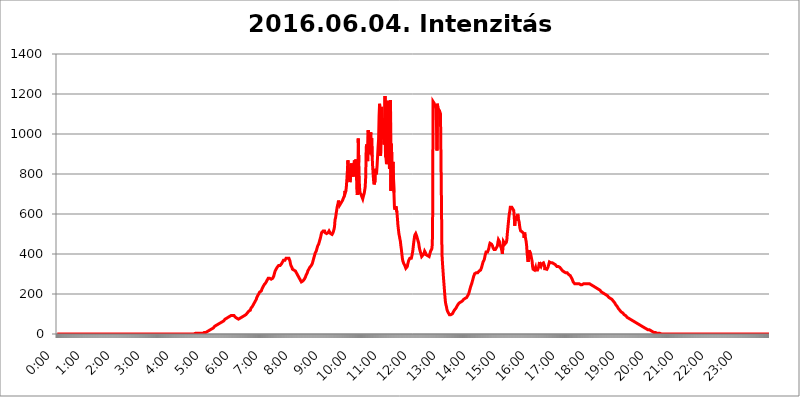
| Category | 2016.06.04. Intenzitás [W/m^2] |
|---|---|
| 0.0 | 0 |
| 0.0006944444444444445 | 0 |
| 0.001388888888888889 | 0 |
| 0.0020833333333333333 | 0 |
| 0.002777777777777778 | 0 |
| 0.003472222222222222 | 0 |
| 0.004166666666666667 | 0 |
| 0.004861111111111111 | 0 |
| 0.005555555555555556 | 0 |
| 0.0062499999999999995 | 0 |
| 0.006944444444444444 | 0 |
| 0.007638888888888889 | 0 |
| 0.008333333333333333 | 0 |
| 0.009027777777777779 | 0 |
| 0.009722222222222222 | 0 |
| 0.010416666666666666 | 0 |
| 0.011111111111111112 | 0 |
| 0.011805555555555555 | 0 |
| 0.012499999999999999 | 0 |
| 0.013194444444444444 | 0 |
| 0.013888888888888888 | 0 |
| 0.014583333333333332 | 0 |
| 0.015277777777777777 | 0 |
| 0.015972222222222224 | 0 |
| 0.016666666666666666 | 0 |
| 0.017361111111111112 | 0 |
| 0.018055555555555557 | 0 |
| 0.01875 | 0 |
| 0.019444444444444445 | 0 |
| 0.02013888888888889 | 0 |
| 0.020833333333333332 | 0 |
| 0.02152777777777778 | 0 |
| 0.022222222222222223 | 0 |
| 0.02291666666666667 | 0 |
| 0.02361111111111111 | 0 |
| 0.024305555555555556 | 0 |
| 0.024999999999999998 | 0 |
| 0.025694444444444447 | 0 |
| 0.02638888888888889 | 0 |
| 0.027083333333333334 | 0 |
| 0.027777777777777776 | 0 |
| 0.02847222222222222 | 0 |
| 0.029166666666666664 | 0 |
| 0.029861111111111113 | 0 |
| 0.030555555555555555 | 0 |
| 0.03125 | 0 |
| 0.03194444444444445 | 0 |
| 0.03263888888888889 | 0 |
| 0.03333333333333333 | 0 |
| 0.034027777777777775 | 0 |
| 0.034722222222222224 | 0 |
| 0.035416666666666666 | 0 |
| 0.036111111111111115 | 0 |
| 0.03680555555555556 | 0 |
| 0.0375 | 0 |
| 0.03819444444444444 | 0 |
| 0.03888888888888889 | 0 |
| 0.03958333333333333 | 0 |
| 0.04027777777777778 | 0 |
| 0.04097222222222222 | 0 |
| 0.041666666666666664 | 0 |
| 0.042361111111111106 | 0 |
| 0.04305555555555556 | 0 |
| 0.043750000000000004 | 0 |
| 0.044444444444444446 | 0 |
| 0.04513888888888889 | 0 |
| 0.04583333333333334 | 0 |
| 0.04652777777777778 | 0 |
| 0.04722222222222222 | 0 |
| 0.04791666666666666 | 0 |
| 0.04861111111111111 | 0 |
| 0.049305555555555554 | 0 |
| 0.049999999999999996 | 0 |
| 0.05069444444444445 | 0 |
| 0.051388888888888894 | 0 |
| 0.052083333333333336 | 0 |
| 0.05277777777777778 | 0 |
| 0.05347222222222222 | 0 |
| 0.05416666666666667 | 0 |
| 0.05486111111111111 | 0 |
| 0.05555555555555555 | 0 |
| 0.05625 | 0 |
| 0.05694444444444444 | 0 |
| 0.057638888888888885 | 0 |
| 0.05833333333333333 | 0 |
| 0.05902777777777778 | 0 |
| 0.059722222222222225 | 0 |
| 0.06041666666666667 | 0 |
| 0.061111111111111116 | 0 |
| 0.06180555555555556 | 0 |
| 0.0625 | 0 |
| 0.06319444444444444 | 0 |
| 0.06388888888888888 | 0 |
| 0.06458333333333334 | 0 |
| 0.06527777777777778 | 0 |
| 0.06597222222222222 | 0 |
| 0.06666666666666667 | 0 |
| 0.06736111111111111 | 0 |
| 0.06805555555555555 | 0 |
| 0.06874999999999999 | 0 |
| 0.06944444444444443 | 0 |
| 0.07013888888888889 | 0 |
| 0.07083333333333333 | 0 |
| 0.07152777777777779 | 0 |
| 0.07222222222222223 | 0 |
| 0.07291666666666667 | 0 |
| 0.07361111111111111 | 0 |
| 0.07430555555555556 | 0 |
| 0.075 | 0 |
| 0.07569444444444444 | 0 |
| 0.0763888888888889 | 0 |
| 0.07708333333333334 | 0 |
| 0.07777777777777778 | 0 |
| 0.07847222222222222 | 0 |
| 0.07916666666666666 | 0 |
| 0.0798611111111111 | 0 |
| 0.08055555555555556 | 0 |
| 0.08125 | 0 |
| 0.08194444444444444 | 0 |
| 0.08263888888888889 | 0 |
| 0.08333333333333333 | 0 |
| 0.08402777777777777 | 0 |
| 0.08472222222222221 | 0 |
| 0.08541666666666665 | 0 |
| 0.08611111111111112 | 0 |
| 0.08680555555555557 | 0 |
| 0.08750000000000001 | 0 |
| 0.08819444444444445 | 0 |
| 0.08888888888888889 | 0 |
| 0.08958333333333333 | 0 |
| 0.09027777777777778 | 0 |
| 0.09097222222222222 | 0 |
| 0.09166666666666667 | 0 |
| 0.09236111111111112 | 0 |
| 0.09305555555555556 | 0 |
| 0.09375 | 0 |
| 0.09444444444444444 | 0 |
| 0.09513888888888888 | 0 |
| 0.09583333333333333 | 0 |
| 0.09652777777777777 | 0 |
| 0.09722222222222222 | 0 |
| 0.09791666666666667 | 0 |
| 0.09861111111111111 | 0 |
| 0.09930555555555555 | 0 |
| 0.09999999999999999 | 0 |
| 0.10069444444444443 | 0 |
| 0.1013888888888889 | 0 |
| 0.10208333333333335 | 0 |
| 0.10277777777777779 | 0 |
| 0.10347222222222223 | 0 |
| 0.10416666666666667 | 0 |
| 0.10486111111111111 | 0 |
| 0.10555555555555556 | 0 |
| 0.10625 | 0 |
| 0.10694444444444444 | 0 |
| 0.1076388888888889 | 0 |
| 0.10833333333333334 | 0 |
| 0.10902777777777778 | 0 |
| 0.10972222222222222 | 0 |
| 0.1111111111111111 | 0 |
| 0.11180555555555556 | 0 |
| 0.11180555555555556 | 0 |
| 0.1125 | 0 |
| 0.11319444444444444 | 0 |
| 0.11388888888888889 | 0 |
| 0.11458333333333333 | 0 |
| 0.11527777777777777 | 0 |
| 0.11597222222222221 | 0 |
| 0.11666666666666665 | 0 |
| 0.1173611111111111 | 0 |
| 0.11805555555555557 | 0 |
| 0.11944444444444445 | 0 |
| 0.12013888888888889 | 0 |
| 0.12083333333333333 | 0 |
| 0.12152777777777778 | 0 |
| 0.12222222222222223 | 0 |
| 0.12291666666666667 | 0 |
| 0.12291666666666667 | 0 |
| 0.12361111111111112 | 0 |
| 0.12430555555555556 | 0 |
| 0.125 | 0 |
| 0.12569444444444444 | 0 |
| 0.12638888888888888 | 0 |
| 0.12708333333333333 | 0 |
| 0.16875 | 0 |
| 0.12847222222222224 | 0 |
| 0.12916666666666668 | 0 |
| 0.12986111111111112 | 0 |
| 0.13055555555555556 | 0 |
| 0.13125 | 0 |
| 0.13194444444444445 | 0 |
| 0.1326388888888889 | 0 |
| 0.13333333333333333 | 0 |
| 0.13402777777777777 | 0 |
| 0.13402777777777777 | 0 |
| 0.13472222222222222 | 0 |
| 0.13541666666666666 | 0 |
| 0.1361111111111111 | 0 |
| 0.13749999999999998 | 0 |
| 0.13819444444444443 | 0 |
| 0.1388888888888889 | 0 |
| 0.13958333333333334 | 0 |
| 0.14027777777777778 | 0 |
| 0.14097222222222222 | 0 |
| 0.14166666666666666 | 0 |
| 0.1423611111111111 | 0 |
| 0.14305555555555557 | 0 |
| 0.14375000000000002 | 0 |
| 0.14444444444444446 | 0 |
| 0.1451388888888889 | 0 |
| 0.1451388888888889 | 0 |
| 0.14652777777777778 | 0 |
| 0.14722222222222223 | 0 |
| 0.14791666666666667 | 0 |
| 0.1486111111111111 | 0 |
| 0.14930555555555555 | 0 |
| 0.15 | 0 |
| 0.15069444444444444 | 0 |
| 0.15138888888888888 | 0 |
| 0.15208333333333332 | 0 |
| 0.15277777777777776 | 0 |
| 0.15347222222222223 | 0 |
| 0.15416666666666667 | 0 |
| 0.15486111111111112 | 0 |
| 0.15555555555555556 | 0 |
| 0.15625 | 0 |
| 0.15694444444444444 | 0 |
| 0.15763888888888888 | 0 |
| 0.15833333333333333 | 0 |
| 0.15902777777777777 | 0 |
| 0.15972222222222224 | 0 |
| 0.16041666666666668 | 0 |
| 0.16111111111111112 | 0 |
| 0.16180555555555556 | 0 |
| 0.1625 | 0 |
| 0.16319444444444445 | 0 |
| 0.1638888888888889 | 0 |
| 0.16458333333333333 | 0 |
| 0.16527777777777777 | 0 |
| 0.16597222222222222 | 0 |
| 0.16666666666666666 | 0 |
| 0.1673611111111111 | 0 |
| 0.16805555555555554 | 0 |
| 0.16874999999999998 | 0 |
| 0.16944444444444443 | 0 |
| 0.17013888888888887 | 0 |
| 0.1708333333333333 | 0 |
| 0.17152777777777775 | 0 |
| 0.17222222222222225 | 0 |
| 0.1729166666666667 | 0 |
| 0.17361111111111113 | 0 |
| 0.17430555555555557 | 0 |
| 0.17500000000000002 | 0 |
| 0.17569444444444446 | 0 |
| 0.1763888888888889 | 0 |
| 0.17708333333333334 | 0 |
| 0.17777777777777778 | 0 |
| 0.17847222222222223 | 0 |
| 0.17916666666666667 | 0 |
| 0.1798611111111111 | 0 |
| 0.18055555555555555 | 0 |
| 0.18125 | 0 |
| 0.18194444444444444 | 0 |
| 0.1826388888888889 | 0 |
| 0.18333333333333335 | 0 |
| 0.1840277777777778 | 0 |
| 0.18472222222222223 | 0 |
| 0.18541666666666667 | 0 |
| 0.18611111111111112 | 0 |
| 0.18680555555555556 | 0 |
| 0.1875 | 0 |
| 0.18819444444444444 | 0 |
| 0.18888888888888888 | 0 |
| 0.18958333333333333 | 0 |
| 0.19027777777777777 | 0 |
| 0.1909722222222222 | 0 |
| 0.19166666666666665 | 0 |
| 0.19236111111111112 | 0 |
| 0.19305555555555554 | 0 |
| 0.19375 | 3.525 |
| 0.19444444444444445 | 3.525 |
| 0.1951388888888889 | 3.525 |
| 0.19583333333333333 | 3.525 |
| 0.19652777777777777 | 3.525 |
| 0.19722222222222222 | 3.525 |
| 0.19791666666666666 | 3.525 |
| 0.1986111111111111 | 3.525 |
| 0.19930555555555554 | 3.525 |
| 0.19999999999999998 | 3.525 |
| 0.20069444444444443 | 3.525 |
| 0.20138888888888887 | 3.525 |
| 0.2020833333333333 | 3.525 |
| 0.2027777777777778 | 3.525 |
| 0.2034722222222222 | 3.525 |
| 0.2041666666666667 | 3.525 |
| 0.20486111111111113 | 3.525 |
| 0.20555555555555557 | 7.887 |
| 0.20625000000000002 | 7.887 |
| 0.20694444444444446 | 7.887 |
| 0.2076388888888889 | 7.887 |
| 0.20833333333333334 | 7.887 |
| 0.20902777777777778 | 12.257 |
| 0.20972222222222223 | 12.257 |
| 0.21041666666666667 | 12.257 |
| 0.2111111111111111 | 16.636 |
| 0.21180555555555555 | 16.636 |
| 0.2125 | 16.636 |
| 0.21319444444444444 | 21.024 |
| 0.2138888888888889 | 21.024 |
| 0.21458333333333335 | 21.024 |
| 0.2152777777777778 | 25.419 |
| 0.21597222222222223 | 25.419 |
| 0.21666666666666667 | 25.419 |
| 0.21736111111111112 | 29.823 |
| 0.21805555555555556 | 29.823 |
| 0.21875 | 29.823 |
| 0.21944444444444444 | 34.234 |
| 0.22013888888888888 | 34.234 |
| 0.22083333333333333 | 38.653 |
| 0.22152777777777777 | 38.653 |
| 0.2222222222222222 | 38.653 |
| 0.22291666666666665 | 43.079 |
| 0.2236111111111111 | 43.079 |
| 0.22430555555555556 | 47.511 |
| 0.225 | 47.511 |
| 0.22569444444444445 | 47.511 |
| 0.2263888888888889 | 47.511 |
| 0.22708333333333333 | 51.951 |
| 0.22777777777777777 | 51.951 |
| 0.22847222222222222 | 56.398 |
| 0.22916666666666666 | 56.398 |
| 0.2298611111111111 | 56.398 |
| 0.23055555555555554 | 56.398 |
| 0.23124999999999998 | 60.85 |
| 0.23194444444444443 | 60.85 |
| 0.23263888888888887 | 60.85 |
| 0.2333333333333333 | 65.31 |
| 0.2340277777777778 | 69.775 |
| 0.2347222222222222 | 69.775 |
| 0.2354166666666667 | 74.246 |
| 0.23611111111111113 | 74.246 |
| 0.23680555555555557 | 78.722 |
| 0.23750000000000002 | 78.722 |
| 0.23819444444444446 | 83.205 |
| 0.2388888888888889 | 83.205 |
| 0.23958333333333334 | 83.205 |
| 0.24027777777777778 | 83.205 |
| 0.24097222222222223 | 87.692 |
| 0.24166666666666667 | 87.692 |
| 0.2423611111111111 | 92.184 |
| 0.24305555555555555 | 92.184 |
| 0.24375 | 92.184 |
| 0.24444444444444446 | 92.184 |
| 0.24513888888888888 | 92.184 |
| 0.24583333333333335 | 92.184 |
| 0.2465277777777778 | 92.184 |
| 0.24722222222222223 | 92.184 |
| 0.24791666666666667 | 92.184 |
| 0.24861111111111112 | 92.184 |
| 0.24930555555555556 | 87.692 |
| 0.25 | 83.205 |
| 0.25069444444444444 | 83.205 |
| 0.2513888888888889 | 78.722 |
| 0.2520833333333333 | 78.722 |
| 0.25277777777777777 | 74.246 |
| 0.2534722222222222 | 74.246 |
| 0.25416666666666665 | 74.246 |
| 0.2548611111111111 | 78.722 |
| 0.2555555555555556 | 78.722 |
| 0.25625000000000003 | 78.722 |
| 0.2569444444444445 | 78.722 |
| 0.2576388888888889 | 83.205 |
| 0.25833333333333336 | 83.205 |
| 0.2590277777777778 | 87.692 |
| 0.25972222222222224 | 87.692 |
| 0.2604166666666667 | 87.692 |
| 0.2611111111111111 | 92.184 |
| 0.26180555555555557 | 92.184 |
| 0.2625 | 92.184 |
| 0.26319444444444445 | 96.682 |
| 0.2638888888888889 | 96.682 |
| 0.26458333333333334 | 96.682 |
| 0.2652777777777778 | 101.184 |
| 0.2659722222222222 | 101.184 |
| 0.26666666666666666 | 105.69 |
| 0.2673611111111111 | 105.69 |
| 0.26805555555555555 | 110.201 |
| 0.26875 | 114.716 |
| 0.26944444444444443 | 114.716 |
| 0.2701388888888889 | 119.235 |
| 0.2708333333333333 | 119.235 |
| 0.27152777777777776 | 128.284 |
| 0.2722222222222222 | 128.284 |
| 0.27291666666666664 | 132.814 |
| 0.2736111111111111 | 137.347 |
| 0.2743055555555555 | 141.884 |
| 0.27499999999999997 | 146.423 |
| 0.27569444444444446 | 150.964 |
| 0.27638888888888885 | 155.509 |
| 0.27708333333333335 | 160.056 |
| 0.2777777777777778 | 164.605 |
| 0.27847222222222223 | 169.156 |
| 0.2791666666666667 | 173.709 |
| 0.2798611111111111 | 182.82 |
| 0.28055555555555556 | 187.378 |
| 0.28125 | 191.937 |
| 0.28194444444444444 | 196.497 |
| 0.2826388888888889 | 201.058 |
| 0.2833333333333333 | 205.62 |
| 0.28402777777777777 | 210.182 |
| 0.2847222222222222 | 210.182 |
| 0.28541666666666665 | 214.746 |
| 0.28611111111111115 | 214.746 |
| 0.28680555555555554 | 219.309 |
| 0.28750000000000003 | 228.436 |
| 0.2881944444444445 | 233 |
| 0.2888888888888889 | 237.564 |
| 0.28958333333333336 | 242.127 |
| 0.2902777777777778 | 246.689 |
| 0.29097222222222224 | 251.251 |
| 0.2916666666666667 | 251.251 |
| 0.2923611111111111 | 255.813 |
| 0.29305555555555557 | 260.373 |
| 0.29375 | 264.932 |
| 0.29444444444444445 | 264.932 |
| 0.2951388888888889 | 269.49 |
| 0.29583333333333334 | 278.603 |
| 0.2965277777777778 | 278.603 |
| 0.2972222222222222 | 283.156 |
| 0.29791666666666666 | 278.603 |
| 0.2986111111111111 | 278.603 |
| 0.29930555555555555 | 274.047 |
| 0.3 | 274.047 |
| 0.30069444444444443 | 274.047 |
| 0.3013888888888889 | 274.047 |
| 0.3020833333333333 | 278.603 |
| 0.30277777777777776 | 283.156 |
| 0.3034722222222222 | 287.709 |
| 0.30416666666666664 | 296.808 |
| 0.3048611111111111 | 305.898 |
| 0.3055555555555555 | 314.98 |
| 0.30624999999999997 | 319.517 |
| 0.3069444444444444 | 324.052 |
| 0.3076388888888889 | 328.584 |
| 0.30833333333333335 | 333.113 |
| 0.3090277777777778 | 333.113 |
| 0.30972222222222223 | 333.113 |
| 0.3104166666666667 | 342.162 |
| 0.3111111111111111 | 342.162 |
| 0.31180555555555556 | 342.162 |
| 0.3125 | 342.162 |
| 0.31319444444444444 | 342.162 |
| 0.3138888888888889 | 342.162 |
| 0.3145833333333333 | 351.198 |
| 0.31527777777777777 | 355.712 |
| 0.3159722222222222 | 360.221 |
| 0.31666666666666665 | 364.728 |
| 0.31736111111111115 | 369.23 |
| 0.31805555555555554 | 369.23 |
| 0.31875000000000003 | 369.23 |
| 0.3194444444444445 | 369.23 |
| 0.3201388888888889 | 373.729 |
| 0.32083333333333336 | 378.224 |
| 0.3215277777777778 | 378.224 |
| 0.32222222222222224 | 378.224 |
| 0.3229166666666667 | 378.224 |
| 0.3236111111111111 | 382.715 |
| 0.32430555555555557 | 382.715 |
| 0.325 | 378.224 |
| 0.32569444444444445 | 373.729 |
| 0.3263888888888889 | 364.728 |
| 0.32708333333333334 | 351.198 |
| 0.3277777777777778 | 342.162 |
| 0.3284722222222222 | 337.639 |
| 0.32916666666666666 | 333.113 |
| 0.3298611111111111 | 324.052 |
| 0.33055555555555555 | 319.517 |
| 0.33125 | 319.517 |
| 0.33194444444444443 | 319.517 |
| 0.3326388888888889 | 319.517 |
| 0.3333333333333333 | 319.517 |
| 0.3340277777777778 | 314.98 |
| 0.3347222222222222 | 310.44 |
| 0.3354166666666667 | 305.898 |
| 0.3361111111111111 | 301.354 |
| 0.3368055555555556 | 296.808 |
| 0.33749999999999997 | 296.808 |
| 0.33819444444444446 | 287.709 |
| 0.33888888888888885 | 283.156 |
| 0.33958333333333335 | 278.603 |
| 0.34027777777777773 | 274.047 |
| 0.34097222222222223 | 269.49 |
| 0.3416666666666666 | 264.932 |
| 0.3423611111111111 | 260.373 |
| 0.3430555555555555 | 260.373 |
| 0.34375 | 264.932 |
| 0.3444444444444445 | 264.932 |
| 0.3451388888888889 | 269.49 |
| 0.3458333333333334 | 269.49 |
| 0.34652777777777777 | 274.047 |
| 0.34722222222222227 | 278.603 |
| 0.34791666666666665 | 283.156 |
| 0.34861111111111115 | 287.709 |
| 0.34930555555555554 | 296.808 |
| 0.35000000000000003 | 301.354 |
| 0.3506944444444444 | 305.898 |
| 0.3513888888888889 | 314.98 |
| 0.3520833333333333 | 319.517 |
| 0.3527777777777778 | 324.052 |
| 0.3534722222222222 | 328.584 |
| 0.3541666666666667 | 333.113 |
| 0.3548611111111111 | 337.639 |
| 0.35555555555555557 | 337.639 |
| 0.35625 | 342.162 |
| 0.35694444444444445 | 346.682 |
| 0.3576388888888889 | 351.198 |
| 0.35833333333333334 | 360.221 |
| 0.3590277777777778 | 369.23 |
| 0.3597222222222222 | 378.224 |
| 0.36041666666666666 | 387.202 |
| 0.3611111111111111 | 396.164 |
| 0.36180555555555555 | 405.108 |
| 0.3625 | 409.574 |
| 0.36319444444444443 | 414.035 |
| 0.3638888888888889 | 422.943 |
| 0.3645833333333333 | 431.833 |
| 0.3652777777777778 | 440.702 |
| 0.3659722222222222 | 445.129 |
| 0.3666666666666667 | 449.551 |
| 0.3673611111111111 | 458.38 |
| 0.3680555555555556 | 467.187 |
| 0.36874999999999997 | 475.972 |
| 0.36944444444444446 | 484.735 |
| 0.37013888888888885 | 497.836 |
| 0.37083333333333335 | 506.542 |
| 0.37152777777777773 | 510.885 |
| 0.37222222222222223 | 510.885 |
| 0.3729166666666666 | 515.223 |
| 0.3736111111111111 | 510.885 |
| 0.3743055555555555 | 510.885 |
| 0.375 | 515.223 |
| 0.3756944444444445 | 506.542 |
| 0.3763888888888889 | 506.542 |
| 0.3770833333333334 | 502.192 |
| 0.37777777777777777 | 502.192 |
| 0.37847222222222227 | 502.192 |
| 0.37916666666666665 | 506.542 |
| 0.37986111111111115 | 506.542 |
| 0.38055555555555554 | 510.885 |
| 0.38125000000000003 | 515.223 |
| 0.3819444444444444 | 515.223 |
| 0.3826388888888889 | 510.885 |
| 0.3833333333333333 | 502.192 |
| 0.3840277777777778 | 497.836 |
| 0.3847222222222222 | 497.836 |
| 0.3854166666666667 | 497.836 |
| 0.3861111111111111 | 497.836 |
| 0.38680555555555557 | 506.542 |
| 0.3875 | 510.885 |
| 0.38819444444444445 | 523.88 |
| 0.3888888888888889 | 536.82 |
| 0.38958333333333334 | 571.049 |
| 0.3902777777777778 | 579.542 |
| 0.3909722222222222 | 596.45 |
| 0.39166666666666666 | 613.252 |
| 0.3923611111111111 | 629.948 |
| 0.39305555555555555 | 642.4 |
| 0.39375 | 650.667 |
| 0.39444444444444443 | 667.123 |
| 0.3951388888888889 | 650.667 |
| 0.3958333333333333 | 642.4 |
| 0.3965277777777778 | 646.537 |
| 0.3972222222222222 | 650.667 |
| 0.3979166666666667 | 654.791 |
| 0.3986111111111111 | 658.909 |
| 0.3993055555555556 | 663.019 |
| 0.39999999999999997 | 667.123 |
| 0.40069444444444446 | 671.22 |
| 0.40138888888888885 | 679.395 |
| 0.40208333333333335 | 683.473 |
| 0.40277777777777773 | 691.608 |
| 0.40347222222222223 | 715.858 |
| 0.4041666666666666 | 707.8 |
| 0.4048611111111111 | 715.858 |
| 0.4055555555555555 | 739.877 |
| 0.40625 | 775.492 |
| 0.4069444444444445 | 814.519 |
| 0.4076388888888889 | 868.305 |
| 0.4083333333333334 | 829.981 |
| 0.40902777777777777 | 787.258 |
| 0.40972222222222227 | 775.492 |
| 0.41041666666666665 | 759.723 |
| 0.41111111111111115 | 767.62 |
| 0.41180555555555554 | 802.868 |
| 0.41250000000000003 | 853.029 |
| 0.4131944444444444 | 818.392 |
| 0.4138888888888889 | 798.974 |
| 0.4145833333333333 | 818.392 |
| 0.4152777777777778 | 787.258 |
| 0.4159722222222222 | 841.526 |
| 0.4166666666666667 | 868.305 |
| 0.4173611111111111 | 868.305 |
| 0.41805555555555557 | 853.029 |
| 0.41875 | 872.114 |
| 0.41944444444444445 | 841.526 |
| 0.4201388888888889 | 727.896 |
| 0.42083333333333334 | 695.666 |
| 0.4215277777777778 | 719.877 |
| 0.4222222222222222 | 977.508 |
| 0.42291666666666666 | 856.855 |
| 0.4236111111111111 | 759.723 |
| 0.42430555555555555 | 715.858 |
| 0.425 | 703.762 |
| 0.42569444444444443 | 699.717 |
| 0.4263888888888889 | 695.666 |
| 0.4270833333333333 | 687.544 |
| 0.4277777777777778 | 683.473 |
| 0.4284722222222222 | 675.311 |
| 0.4291666666666667 | 675.311 |
| 0.4298611111111111 | 695.666 |
| 0.4305555555555556 | 703.762 |
| 0.43124999999999997 | 707.8 |
| 0.43194444444444446 | 735.89 |
| 0.43263888888888885 | 787.258 |
| 0.43333333333333335 | 932.576 |
| 0.43402777777777773 | 947.58 |
| 0.43472222222222223 | 891.099 |
| 0.4354166666666666 | 864.493 |
| 0.4361111111111111 | 1018.587 |
| 0.4368055555555555 | 999.916 |
| 0.4375 | 966.295 |
| 0.4381944444444445 | 943.832 |
| 0.4388888888888889 | 898.668 |
| 0.4395833333333334 | 1007.383 |
| 0.44027777777777777 | 943.832 |
| 0.44097222222222227 | 977.508 |
| 0.44166666666666665 | 887.309 |
| 0.44236111111111115 | 837.682 |
| 0.44305555555555554 | 798.974 |
| 0.44375000000000003 | 763.674 |
| 0.4444444444444444 | 747.834 |
| 0.4451388888888889 | 751.803 |
| 0.4458333333333333 | 767.62 |
| 0.4465277777777778 | 826.123 |
| 0.4472222222222222 | 798.974 |
| 0.4479166666666667 | 806.757 |
| 0.4486111111111111 | 841.526 |
| 0.44930555555555557 | 837.682 |
| 0.45 | 936.33 |
| 0.45069444444444445 | 973.772 |
| 0.4513888888888889 | 1089.873 |
| 0.45208333333333334 | 1150.946 |
| 0.4527777777777778 | 1097.437 |
| 0.4534722222222222 | 891.099 |
| 0.45416666666666666 | 996.182 |
| 0.4548611111111111 | 1135.543 |
| 0.45555555555555555 | 973.772 |
| 0.45625 | 977.508 |
| 0.45694444444444443 | 1078.555 |
| 0.4576388888888889 | 1029.798 |
| 0.4583333333333333 | 947.58 |
| 0.4590277777777778 | 1048.508 |
| 0.4597222222222222 | 1189.969 |
| 0.4604166666666667 | 887.309 |
| 0.4611111111111111 | 879.719 |
| 0.4618055555555556 | 849.199 |
| 0.46249999999999997 | 898.668 |
| 0.46319444444444446 | 1166.46 |
| 0.46388888888888885 | 1007.383 |
| 0.46458333333333335 | 898.668 |
| 0.46527777777777773 | 984.98 |
| 0.46597222222222223 | 826.123 |
| 0.4666666666666666 | 845.365 |
| 0.4673611111111111 | 1170.358 |
| 0.4680555555555555 | 715.858 |
| 0.46875 | 951.327 |
| 0.4694444444444445 | 826.123 |
| 0.4701388888888889 | 814.519 |
| 0.4708333333333334 | 860.676 |
| 0.47152777777777777 | 864.493 |
| 0.47222222222222227 | 707.8 |
| 0.47291666666666665 | 634.105 |
| 0.47361111111111115 | 621.613 |
| 0.47430555555555554 | 617.436 |
| 0.47500000000000003 | 638.256 |
| 0.4756944444444444 | 634.105 |
| 0.4763888888888889 | 609.062 |
| 0.4770833333333333 | 579.542 |
| 0.4777777777777778 | 545.416 |
| 0.4784722222222222 | 523.88 |
| 0.4791666666666667 | 502.192 |
| 0.4798611111111111 | 489.108 |
| 0.48055555555555557 | 475.972 |
| 0.48125 | 462.786 |
| 0.48194444444444445 | 440.702 |
| 0.4826388888888889 | 422.943 |
| 0.48333333333333334 | 400.638 |
| 0.4840277777777778 | 378.224 |
| 0.4847222222222222 | 364.728 |
| 0.48541666666666666 | 360.221 |
| 0.4861111111111111 | 351.198 |
| 0.48680555555555555 | 346.682 |
| 0.4875 | 342.162 |
| 0.48819444444444443 | 337.639 |
| 0.4888888888888889 | 328.584 |
| 0.4895833333333333 | 324.052 |
| 0.4902777777777778 | 328.584 |
| 0.4909722222222222 | 337.639 |
| 0.4916666666666667 | 351.198 |
| 0.4923611111111111 | 360.221 |
| 0.4930555555555556 | 369.23 |
| 0.49374999999999997 | 373.729 |
| 0.49444444444444446 | 378.224 |
| 0.49513888888888885 | 378.224 |
| 0.49583333333333335 | 378.224 |
| 0.49652777777777773 | 378.224 |
| 0.49722222222222223 | 387.202 |
| 0.4979166666666666 | 400.638 |
| 0.4986111111111111 | 414.035 |
| 0.4993055555555555 | 436.27 |
| 0.5 | 458.38 |
| 0.5006944444444444 | 475.972 |
| 0.5013888888888889 | 493.475 |
| 0.5020833333333333 | 497.836 |
| 0.5027777777777778 | 502.192 |
| 0.5034722222222222 | 497.836 |
| 0.5041666666666667 | 489.108 |
| 0.5048611111111111 | 480.356 |
| 0.5055555555555555 | 471.582 |
| 0.50625 | 462.786 |
| 0.5069444444444444 | 453.968 |
| 0.5076388888888889 | 436.27 |
| 0.5083333333333333 | 422.943 |
| 0.5090277777777777 | 414.035 |
| 0.5097222222222222 | 405.108 |
| 0.5104166666666666 | 396.164 |
| 0.5111111111111112 | 387.202 |
| 0.5118055555555555 | 387.202 |
| 0.5125000000000001 | 391.685 |
| 0.5131944444444444 | 396.164 |
| 0.513888888888889 | 396.164 |
| 0.5145833333333333 | 405.108 |
| 0.5152777777777778 | 414.035 |
| 0.5159722222222222 | 409.574 |
| 0.5166666666666667 | 405.108 |
| 0.517361111111111 | 396.164 |
| 0.5180555555555556 | 391.685 |
| 0.5187499999999999 | 391.685 |
| 0.5194444444444445 | 391.685 |
| 0.5201388888888888 | 387.202 |
| 0.5208333333333334 | 387.202 |
| 0.5215277777777778 | 387.202 |
| 0.5222222222222223 | 396.164 |
| 0.5229166666666667 | 405.108 |
| 0.5236111111111111 | 414.035 |
| 0.5243055555555556 | 418.492 |
| 0.525 | 422.943 |
| 0.5256944444444445 | 431.833 |
| 0.5263888888888889 | 497.836 |
| 0.5270833333333333 | 1162.571 |
| 0.5277777777777778 | 1162.571 |
| 0.5284722222222222 | 1154.814 |
| 0.5291666666666667 | 1147.086 |
| 0.5298611111111111 | 1147.086 |
| 0.5305555555555556 | 1139.384 |
| 0.53125 | 1147.086 |
| 0.5319444444444444 | 1037.277 |
| 0.5326388888888889 | 917.534 |
| 0.5333333333333333 | 1150.946 |
| 0.5340277777777778 | 1108.816 |
| 0.5347222222222222 | 1124.056 |
| 0.5354166666666667 | 1120.238 |
| 0.5361111111111111 | 1116.426 |
| 0.5368055555555555 | 1116.426 |
| 0.5375 | 1101.226 |
| 0.5381944444444444 | 1101.226 |
| 0.5388888888888889 | 650.667 |
| 0.5395833333333333 | 400.638 |
| 0.5402777777777777 | 355.712 |
| 0.5409722222222222 | 319.517 |
| 0.5416666666666666 | 283.156 |
| 0.5423611111111112 | 251.251 |
| 0.5430555555555555 | 219.309 |
| 0.5437500000000001 | 187.378 |
| 0.5444444444444444 | 160.056 |
| 0.545138888888889 | 146.423 |
| 0.5458333333333333 | 137.347 |
| 0.5465277777777778 | 123.758 |
| 0.5472222222222222 | 114.716 |
| 0.5479166666666667 | 110.201 |
| 0.548611111111111 | 105.69 |
| 0.5493055555555556 | 101.184 |
| 0.5499999999999999 | 96.682 |
| 0.5506944444444445 | 92.184 |
| 0.5513888888888888 | 96.682 |
| 0.5520833333333334 | 96.682 |
| 0.5527777777777778 | 96.682 |
| 0.5534722222222223 | 101.184 |
| 0.5541666666666667 | 101.184 |
| 0.5548611111111111 | 105.69 |
| 0.5555555555555556 | 110.201 |
| 0.55625 | 114.716 |
| 0.5569444444444445 | 119.235 |
| 0.5576388888888889 | 119.235 |
| 0.5583333333333333 | 123.758 |
| 0.5590277777777778 | 128.284 |
| 0.5597222222222222 | 132.814 |
| 0.5604166666666667 | 137.347 |
| 0.5611111111111111 | 141.884 |
| 0.5618055555555556 | 146.423 |
| 0.5625 | 146.423 |
| 0.5631944444444444 | 150.964 |
| 0.5638888888888889 | 155.509 |
| 0.5645833333333333 | 155.509 |
| 0.5652777777777778 | 160.056 |
| 0.5659722222222222 | 160.056 |
| 0.5666666666666667 | 164.605 |
| 0.5673611111111111 | 164.605 |
| 0.5680555555555555 | 164.605 |
| 0.56875 | 169.156 |
| 0.5694444444444444 | 169.156 |
| 0.5701388888888889 | 173.709 |
| 0.5708333333333333 | 173.709 |
| 0.5715277777777777 | 173.709 |
| 0.5722222222222222 | 178.264 |
| 0.5729166666666666 | 178.264 |
| 0.5736111111111112 | 182.82 |
| 0.5743055555555555 | 182.82 |
| 0.5750000000000001 | 182.82 |
| 0.5756944444444444 | 191.937 |
| 0.576388888888889 | 196.497 |
| 0.5770833333333333 | 201.058 |
| 0.5777777777777778 | 210.182 |
| 0.5784722222222222 | 219.309 |
| 0.5791666666666667 | 228.436 |
| 0.579861111111111 | 237.564 |
| 0.5805555555555556 | 242.127 |
| 0.5812499999999999 | 251.251 |
| 0.5819444444444445 | 260.373 |
| 0.5826388888888888 | 269.49 |
| 0.5833333333333334 | 278.603 |
| 0.5840277777777778 | 287.709 |
| 0.5847222222222223 | 292.259 |
| 0.5854166666666667 | 301.354 |
| 0.5861111111111111 | 305.898 |
| 0.5868055555555556 | 305.898 |
| 0.5875 | 305.898 |
| 0.5881944444444445 | 301.354 |
| 0.5888888888888889 | 305.898 |
| 0.5895833333333333 | 305.898 |
| 0.5902777777777778 | 310.44 |
| 0.5909722222222222 | 310.44 |
| 0.5916666666666667 | 314.98 |
| 0.5923611111111111 | 314.98 |
| 0.5930555555555556 | 314.98 |
| 0.59375 | 319.517 |
| 0.5944444444444444 | 324.052 |
| 0.5951388888888889 | 333.113 |
| 0.5958333333333333 | 342.162 |
| 0.5965277777777778 | 351.198 |
| 0.5972222222222222 | 360.221 |
| 0.5979166666666667 | 364.728 |
| 0.5986111111111111 | 369.23 |
| 0.5993055555555555 | 378.224 |
| 0.6 | 391.685 |
| 0.6006944444444444 | 400.638 |
| 0.6013888888888889 | 409.574 |
| 0.6020833333333333 | 414.035 |
| 0.6027777777777777 | 409.574 |
| 0.6034722222222222 | 409.574 |
| 0.6041666666666666 | 414.035 |
| 0.6048611111111112 | 422.943 |
| 0.6055555555555555 | 431.833 |
| 0.6062500000000001 | 445.129 |
| 0.6069444444444444 | 453.968 |
| 0.607638888888889 | 458.38 |
| 0.6083333333333333 | 458.38 |
| 0.6090277777777778 | 449.551 |
| 0.6097222222222222 | 445.129 |
| 0.6104166666666667 | 440.702 |
| 0.611111111111111 | 431.833 |
| 0.6118055555555556 | 427.39 |
| 0.6124999999999999 | 422.943 |
| 0.6131944444444445 | 422.943 |
| 0.6138888888888888 | 422.943 |
| 0.6145833333333334 | 422.943 |
| 0.6152777777777778 | 422.943 |
| 0.6159722222222223 | 431.833 |
| 0.6166666666666667 | 431.833 |
| 0.6173611111111111 | 440.702 |
| 0.6180555555555556 | 458.38 |
| 0.61875 | 471.582 |
| 0.6194444444444445 | 471.582 |
| 0.6201388888888889 | 462.786 |
| 0.6208333333333333 | 449.551 |
| 0.6215277777777778 | 445.129 |
| 0.6222222222222222 | 449.551 |
| 0.6229166666666667 | 427.39 |
| 0.6236111111111111 | 431.833 |
| 0.6243055555555556 | 400.638 |
| 0.625 | 436.27 |
| 0.6256944444444444 | 462.786 |
| 0.6263888888888889 | 462.786 |
| 0.6270833333333333 | 458.38 |
| 0.6277777777777778 | 449.551 |
| 0.6284722222222222 | 449.551 |
| 0.6291666666666667 | 453.968 |
| 0.6298611111111111 | 458.38 |
| 0.6305555555555555 | 471.582 |
| 0.63125 | 502.192 |
| 0.6319444444444444 | 528.2 |
| 0.6326388888888889 | 553.986 |
| 0.6333333333333333 | 579.542 |
| 0.6340277777777777 | 600.661 |
| 0.6347222222222222 | 613.252 |
| 0.6354166666666666 | 634.105 |
| 0.6361111111111112 | 634.105 |
| 0.6368055555555555 | 634.105 |
| 0.6375000000000001 | 634.105 |
| 0.6381944444444444 | 629.948 |
| 0.638888888888889 | 625.784 |
| 0.6395833333333333 | 621.613 |
| 0.6402777777777778 | 617.436 |
| 0.6409722222222222 | 583.779 |
| 0.6416666666666667 | 541.121 |
| 0.642361111111111 | 588.009 |
| 0.6430555555555556 | 583.779 |
| 0.6437499999999999 | 583.779 |
| 0.6444444444444445 | 566.793 |
| 0.6451388888888888 | 588.009 |
| 0.6458333333333334 | 600.661 |
| 0.6465277777777778 | 579.542 |
| 0.6472222222222223 | 583.779 |
| 0.6479166666666667 | 558.261 |
| 0.6486111111111111 | 536.82 |
| 0.6493055555555556 | 523.88 |
| 0.65 | 515.223 |
| 0.6506944444444445 | 510.885 |
| 0.6513888888888889 | 510.885 |
| 0.6520833333333333 | 510.885 |
| 0.6527777777777778 | 506.542 |
| 0.6534722222222222 | 510.885 |
| 0.6541666666666667 | 502.192 |
| 0.6548611111111111 | 480.356 |
| 0.6555555555555556 | 506.542 |
| 0.65625 | 489.108 |
| 0.6569444444444444 | 475.972 |
| 0.6576388888888889 | 462.786 |
| 0.6583333333333333 | 440.702 |
| 0.6590277777777778 | 405.108 |
| 0.6597222222222222 | 378.224 |
| 0.6604166666666667 | 360.221 |
| 0.6611111111111111 | 360.221 |
| 0.6618055555555555 | 418.492 |
| 0.6625 | 422.943 |
| 0.6631944444444444 | 422.943 |
| 0.6638888888888889 | 400.638 |
| 0.6645833333333333 | 405.108 |
| 0.6652777777777777 | 396.164 |
| 0.6659722222222222 | 364.728 |
| 0.6666666666666666 | 337.639 |
| 0.6673611111111111 | 324.052 |
| 0.6680555555555556 | 319.517 |
| 0.6687500000000001 | 319.517 |
| 0.6694444444444444 | 319.517 |
| 0.6701388888888888 | 319.517 |
| 0.6708333333333334 | 333.113 |
| 0.6715277777777778 | 319.517 |
| 0.6722222222222222 | 319.517 |
| 0.6729166666666666 | 319.517 |
| 0.6736111111111112 | 319.517 |
| 0.6743055555555556 | 324.052 |
| 0.6749999999999999 | 333.113 |
| 0.6756944444444444 | 337.639 |
| 0.6763888888888889 | 360.221 |
| 0.6770833333333334 | 346.682 |
| 0.6777777777777777 | 342.162 |
| 0.6784722222222223 | 337.639 |
| 0.6791666666666667 | 342.162 |
| 0.6798611111111111 | 351.198 |
| 0.6805555555555555 | 355.712 |
| 0.68125 | 355.712 |
| 0.6819444444444445 | 355.712 |
| 0.6826388888888889 | 351.198 |
| 0.6833333333333332 | 342.162 |
| 0.6840277777777778 | 319.517 |
| 0.6847222222222222 | 328.584 |
| 0.6854166666666667 | 324.052 |
| 0.686111111111111 | 324.052 |
| 0.6868055555555556 | 324.052 |
| 0.6875 | 324.052 |
| 0.6881944444444444 | 333.113 |
| 0.688888888888889 | 333.113 |
| 0.6895833333333333 | 351.198 |
| 0.6902777777777778 | 360.221 |
| 0.6909722222222222 | 360.221 |
| 0.6916666666666668 | 360.221 |
| 0.6923611111111111 | 355.712 |
| 0.6930555555555555 | 355.712 |
| 0.69375 | 355.712 |
| 0.6944444444444445 | 355.712 |
| 0.6951388888888889 | 351.198 |
| 0.6958333333333333 | 351.198 |
| 0.6965277777777777 | 351.198 |
| 0.6972222222222223 | 351.198 |
| 0.6979166666666666 | 346.682 |
| 0.6986111111111111 | 346.682 |
| 0.6993055555555556 | 346.682 |
| 0.7000000000000001 | 342.162 |
| 0.7006944444444444 | 337.639 |
| 0.7013888888888888 | 337.639 |
| 0.7020833333333334 | 337.639 |
| 0.7027777777777778 | 337.639 |
| 0.7034722222222222 | 333.113 |
| 0.7041666666666666 | 333.113 |
| 0.7048611111111112 | 333.113 |
| 0.7055555555555556 | 328.584 |
| 0.7062499999999999 | 328.584 |
| 0.7069444444444444 | 324.052 |
| 0.7076388888888889 | 324.052 |
| 0.7083333333333334 | 319.517 |
| 0.7090277777777777 | 314.98 |
| 0.7097222222222223 | 314.98 |
| 0.7104166666666667 | 310.44 |
| 0.7111111111111111 | 310.44 |
| 0.7118055555555555 | 305.898 |
| 0.7125 | 305.898 |
| 0.7131944444444445 | 305.898 |
| 0.7138888888888889 | 305.898 |
| 0.7145833333333332 | 305.898 |
| 0.7152777777777778 | 305.898 |
| 0.7159722222222222 | 301.354 |
| 0.7166666666666667 | 301.354 |
| 0.717361111111111 | 296.808 |
| 0.7180555555555556 | 296.808 |
| 0.71875 | 292.259 |
| 0.7194444444444444 | 292.259 |
| 0.720138888888889 | 287.709 |
| 0.7208333333333333 | 283.156 |
| 0.7215277777777778 | 278.603 |
| 0.7222222222222222 | 274.047 |
| 0.7229166666666668 | 269.49 |
| 0.7236111111111111 | 260.373 |
| 0.7243055555555555 | 255.813 |
| 0.725 | 255.813 |
| 0.7256944444444445 | 251.251 |
| 0.7263888888888889 | 251.251 |
| 0.7270833333333333 | 251.251 |
| 0.7277777777777777 | 251.251 |
| 0.7284722222222223 | 251.251 |
| 0.7291666666666666 | 251.251 |
| 0.7298611111111111 | 251.251 |
| 0.7305555555555556 | 251.251 |
| 0.7312500000000001 | 251.251 |
| 0.7319444444444444 | 251.251 |
| 0.7326388888888888 | 251.251 |
| 0.7333333333333334 | 246.689 |
| 0.7340277777777778 | 246.689 |
| 0.7347222222222222 | 246.689 |
| 0.7354166666666666 | 246.689 |
| 0.7361111111111112 | 246.689 |
| 0.7368055555555556 | 246.689 |
| 0.7374999999999999 | 246.689 |
| 0.7381944444444444 | 251.251 |
| 0.7388888888888889 | 251.251 |
| 0.7395833333333334 | 251.251 |
| 0.7402777777777777 | 251.251 |
| 0.7409722222222223 | 251.251 |
| 0.7416666666666667 | 251.251 |
| 0.7423611111111111 | 251.251 |
| 0.7430555555555555 | 251.251 |
| 0.74375 | 251.251 |
| 0.7444444444444445 | 251.251 |
| 0.7451388888888889 | 251.251 |
| 0.7458333333333332 | 251.251 |
| 0.7465277777777778 | 251.251 |
| 0.7472222222222222 | 246.689 |
| 0.7479166666666667 | 246.689 |
| 0.748611111111111 | 246.689 |
| 0.7493055555555556 | 242.127 |
| 0.75 | 242.127 |
| 0.7506944444444444 | 242.127 |
| 0.751388888888889 | 242.127 |
| 0.7520833333333333 | 242.127 |
| 0.7527777777777778 | 237.564 |
| 0.7534722222222222 | 237.564 |
| 0.7541666666666668 | 237.564 |
| 0.7548611111111111 | 233 |
| 0.7555555555555555 | 233 |
| 0.75625 | 233 |
| 0.7569444444444445 | 228.436 |
| 0.7576388888888889 | 228.436 |
| 0.7583333333333333 | 228.436 |
| 0.7590277777777777 | 223.873 |
| 0.7597222222222223 | 223.873 |
| 0.7604166666666666 | 219.309 |
| 0.7611111111111111 | 219.309 |
| 0.7618055555555556 | 214.746 |
| 0.7625000000000001 | 214.746 |
| 0.7631944444444444 | 210.182 |
| 0.7638888888888888 | 210.182 |
| 0.7645833333333334 | 210.182 |
| 0.7652777777777778 | 205.62 |
| 0.7659722222222222 | 205.62 |
| 0.7666666666666666 | 201.058 |
| 0.7673611111111112 | 201.058 |
| 0.7680555555555556 | 201.058 |
| 0.7687499999999999 | 196.497 |
| 0.7694444444444444 | 196.497 |
| 0.7701388888888889 | 191.937 |
| 0.7708333333333334 | 191.937 |
| 0.7715277777777777 | 191.937 |
| 0.7722222222222223 | 187.378 |
| 0.7729166666666667 | 187.378 |
| 0.7736111111111111 | 182.82 |
| 0.7743055555555555 | 182.82 |
| 0.775 | 182.82 |
| 0.7756944444444445 | 178.264 |
| 0.7763888888888889 | 178.264 |
| 0.7770833333333332 | 173.709 |
| 0.7777777777777778 | 173.709 |
| 0.7784722222222222 | 169.156 |
| 0.7791666666666667 | 169.156 |
| 0.779861111111111 | 164.605 |
| 0.7805555555555556 | 164.605 |
| 0.78125 | 160.056 |
| 0.7819444444444444 | 155.509 |
| 0.782638888888889 | 150.964 |
| 0.7833333333333333 | 146.423 |
| 0.7840277777777778 | 141.884 |
| 0.7847222222222222 | 141.884 |
| 0.7854166666666668 | 137.347 |
| 0.7861111111111111 | 132.814 |
| 0.7868055555555555 | 128.284 |
| 0.7875 | 128.284 |
| 0.7881944444444445 | 123.758 |
| 0.7888888888888889 | 119.235 |
| 0.7895833333333333 | 119.235 |
| 0.7902777777777777 | 114.716 |
| 0.7909722222222223 | 110.201 |
| 0.7916666666666666 | 110.201 |
| 0.7923611111111111 | 105.69 |
| 0.7930555555555556 | 105.69 |
| 0.7937500000000001 | 101.184 |
| 0.7944444444444444 | 101.184 |
| 0.7951388888888888 | 96.682 |
| 0.7958333333333334 | 92.184 |
| 0.7965277777777778 | 92.184 |
| 0.7972222222222222 | 92.184 |
| 0.7979166666666666 | 87.692 |
| 0.7986111111111112 | 87.692 |
| 0.7993055555555556 | 83.205 |
| 0.7999999999999999 | 83.205 |
| 0.8006944444444444 | 83.205 |
| 0.8013888888888889 | 78.722 |
| 0.8020833333333334 | 78.722 |
| 0.8027777777777777 | 74.246 |
| 0.8034722222222223 | 74.246 |
| 0.8041666666666667 | 74.246 |
| 0.8048611111111111 | 69.775 |
| 0.8055555555555555 | 69.775 |
| 0.80625 | 69.775 |
| 0.8069444444444445 | 65.31 |
| 0.8076388888888889 | 65.31 |
| 0.8083333333333332 | 65.31 |
| 0.8090277777777778 | 65.31 |
| 0.8097222222222222 | 60.85 |
| 0.8104166666666667 | 60.85 |
| 0.811111111111111 | 56.398 |
| 0.8118055555555556 | 56.398 |
| 0.8125 | 56.398 |
| 0.8131944444444444 | 51.951 |
| 0.813888888888889 | 51.951 |
| 0.8145833333333333 | 51.951 |
| 0.8152777777777778 | 47.511 |
| 0.8159722222222222 | 47.511 |
| 0.8166666666666668 | 47.511 |
| 0.8173611111111111 | 43.079 |
| 0.8180555555555555 | 43.079 |
| 0.81875 | 43.079 |
| 0.8194444444444445 | 38.653 |
| 0.8201388888888889 | 38.653 |
| 0.8208333333333333 | 38.653 |
| 0.8215277777777777 | 34.234 |
| 0.8222222222222223 | 34.234 |
| 0.8229166666666666 | 34.234 |
| 0.8236111111111111 | 29.823 |
| 0.8243055555555556 | 29.823 |
| 0.8250000000000001 | 29.823 |
| 0.8256944444444444 | 29.823 |
| 0.8263888888888888 | 25.419 |
| 0.8270833333333334 | 25.419 |
| 0.8277777777777778 | 25.419 |
| 0.8284722222222222 | 21.024 |
| 0.8291666666666666 | 21.024 |
| 0.8298611111111112 | 21.024 |
| 0.8305555555555556 | 21.024 |
| 0.8312499999999999 | 16.636 |
| 0.8319444444444444 | 16.636 |
| 0.8326388888888889 | 16.636 |
| 0.8333333333333334 | 16.636 |
| 0.8340277777777777 | 12.257 |
| 0.8347222222222223 | 12.257 |
| 0.8354166666666667 | 12.257 |
| 0.8361111111111111 | 12.257 |
| 0.8368055555555555 | 7.887 |
| 0.8375 | 7.887 |
| 0.8381944444444445 | 7.887 |
| 0.8388888888888889 | 7.887 |
| 0.8395833333333332 | 7.887 |
| 0.8402777777777778 | 3.525 |
| 0.8409722222222222 | 3.525 |
| 0.8416666666666667 | 3.525 |
| 0.842361111111111 | 3.525 |
| 0.8430555555555556 | 3.525 |
| 0.84375 | 3.525 |
| 0.8444444444444444 | 3.525 |
| 0.845138888888889 | 3.525 |
| 0.8458333333333333 | 3.525 |
| 0.8465277777777778 | 0 |
| 0.8472222222222222 | 0 |
| 0.8479166666666668 | 0 |
| 0.8486111111111111 | 0 |
| 0.8493055555555555 | 0 |
| 0.85 | 0 |
| 0.8506944444444445 | 0 |
| 0.8513888888888889 | 0 |
| 0.8520833333333333 | 0 |
| 0.8527777777777777 | 0 |
| 0.8534722222222223 | 0 |
| 0.8541666666666666 | 0 |
| 0.8548611111111111 | 0 |
| 0.8555555555555556 | 0 |
| 0.8562500000000001 | 0 |
| 0.8569444444444444 | 0 |
| 0.8576388888888888 | 0 |
| 0.8583333333333334 | 0 |
| 0.8590277777777778 | 0 |
| 0.8597222222222222 | 0 |
| 0.8604166666666666 | 0 |
| 0.8611111111111112 | 0 |
| 0.8618055555555556 | 0 |
| 0.8624999999999999 | 0 |
| 0.8631944444444444 | 0 |
| 0.8638888888888889 | 0 |
| 0.8645833333333334 | 0 |
| 0.8652777777777777 | 0 |
| 0.8659722222222223 | 0 |
| 0.8666666666666667 | 0 |
| 0.8673611111111111 | 0 |
| 0.8680555555555555 | 0 |
| 0.86875 | 0 |
| 0.8694444444444445 | 0 |
| 0.8701388888888889 | 0 |
| 0.8708333333333332 | 0 |
| 0.8715277777777778 | 0 |
| 0.8722222222222222 | 0 |
| 0.8729166666666667 | 0 |
| 0.873611111111111 | 0 |
| 0.8743055555555556 | 0 |
| 0.875 | 0 |
| 0.8756944444444444 | 0 |
| 0.876388888888889 | 0 |
| 0.8770833333333333 | 0 |
| 0.8777777777777778 | 0 |
| 0.8784722222222222 | 0 |
| 0.8791666666666668 | 0 |
| 0.8798611111111111 | 0 |
| 0.8805555555555555 | 0 |
| 0.88125 | 0 |
| 0.8819444444444445 | 0 |
| 0.8826388888888889 | 0 |
| 0.8833333333333333 | 0 |
| 0.8840277777777777 | 0 |
| 0.8847222222222223 | 0 |
| 0.8854166666666666 | 0 |
| 0.8861111111111111 | 0 |
| 0.8868055555555556 | 0 |
| 0.8875000000000001 | 0 |
| 0.8881944444444444 | 0 |
| 0.8888888888888888 | 0 |
| 0.8895833333333334 | 0 |
| 0.8902777777777778 | 0 |
| 0.8909722222222222 | 0 |
| 0.8916666666666666 | 0 |
| 0.8923611111111112 | 0 |
| 0.8930555555555556 | 0 |
| 0.8937499999999999 | 0 |
| 0.8944444444444444 | 0 |
| 0.8951388888888889 | 0 |
| 0.8958333333333334 | 0 |
| 0.8965277777777777 | 0 |
| 0.8972222222222223 | 0 |
| 0.8979166666666667 | 0 |
| 0.8986111111111111 | 0 |
| 0.8993055555555555 | 0 |
| 0.9 | 0 |
| 0.9006944444444445 | 0 |
| 0.9013888888888889 | 0 |
| 0.9020833333333332 | 0 |
| 0.9027777777777778 | 0 |
| 0.9034722222222222 | 0 |
| 0.9041666666666667 | 0 |
| 0.904861111111111 | 0 |
| 0.9055555555555556 | 0 |
| 0.90625 | 0 |
| 0.9069444444444444 | 0 |
| 0.907638888888889 | 0 |
| 0.9083333333333333 | 0 |
| 0.9090277777777778 | 0 |
| 0.9097222222222222 | 0 |
| 0.9104166666666668 | 0 |
| 0.9111111111111111 | 0 |
| 0.9118055555555555 | 0 |
| 0.9125 | 0 |
| 0.9131944444444445 | 0 |
| 0.9138888888888889 | 0 |
| 0.9145833333333333 | 0 |
| 0.9152777777777777 | 0 |
| 0.9159722222222223 | 0 |
| 0.9166666666666666 | 0 |
| 0.9173611111111111 | 0 |
| 0.9180555555555556 | 0 |
| 0.9187500000000001 | 0 |
| 0.9194444444444444 | 0 |
| 0.9201388888888888 | 0 |
| 0.9208333333333334 | 0 |
| 0.9215277777777778 | 0 |
| 0.9222222222222222 | 0 |
| 0.9229166666666666 | 0 |
| 0.9236111111111112 | 0 |
| 0.9243055555555556 | 0 |
| 0.9249999999999999 | 0 |
| 0.9256944444444444 | 0 |
| 0.9263888888888889 | 0 |
| 0.9270833333333334 | 0 |
| 0.9277777777777777 | 0 |
| 0.9284722222222223 | 0 |
| 0.9291666666666667 | 0 |
| 0.9298611111111111 | 0 |
| 0.9305555555555555 | 0 |
| 0.93125 | 0 |
| 0.9319444444444445 | 0 |
| 0.9326388888888889 | 0 |
| 0.9333333333333332 | 0 |
| 0.9340277777777778 | 0 |
| 0.9347222222222222 | 0 |
| 0.9354166666666667 | 0 |
| 0.936111111111111 | 0 |
| 0.9368055555555556 | 0 |
| 0.9375 | 0 |
| 0.9381944444444444 | 0 |
| 0.938888888888889 | 0 |
| 0.9395833333333333 | 0 |
| 0.9402777777777778 | 0 |
| 0.9409722222222222 | 0 |
| 0.9416666666666668 | 0 |
| 0.9423611111111111 | 0 |
| 0.9430555555555555 | 0 |
| 0.94375 | 0 |
| 0.9444444444444445 | 0 |
| 0.9451388888888889 | 0 |
| 0.9458333333333333 | 0 |
| 0.9465277777777777 | 0 |
| 0.9472222222222223 | 0 |
| 0.9479166666666666 | 0 |
| 0.9486111111111111 | 0 |
| 0.9493055555555556 | 0 |
| 0.9500000000000001 | 0 |
| 0.9506944444444444 | 0 |
| 0.9513888888888888 | 0 |
| 0.9520833333333334 | 0 |
| 0.9527777777777778 | 0 |
| 0.9534722222222222 | 0 |
| 0.9541666666666666 | 0 |
| 0.9548611111111112 | 0 |
| 0.9555555555555556 | 0 |
| 0.9562499999999999 | 0 |
| 0.9569444444444444 | 0 |
| 0.9576388888888889 | 0 |
| 0.9583333333333334 | 0 |
| 0.9590277777777777 | 0 |
| 0.9597222222222223 | 0 |
| 0.9604166666666667 | 0 |
| 0.9611111111111111 | 0 |
| 0.9618055555555555 | 0 |
| 0.9625 | 0 |
| 0.9631944444444445 | 0 |
| 0.9638888888888889 | 0 |
| 0.9645833333333332 | 0 |
| 0.9652777777777778 | 0 |
| 0.9659722222222222 | 0 |
| 0.9666666666666667 | 0 |
| 0.967361111111111 | 0 |
| 0.9680555555555556 | 0 |
| 0.96875 | 0 |
| 0.9694444444444444 | 0 |
| 0.970138888888889 | 0 |
| 0.9708333333333333 | 0 |
| 0.9715277777777778 | 0 |
| 0.9722222222222222 | 0 |
| 0.9729166666666668 | 0 |
| 0.9736111111111111 | 0 |
| 0.9743055555555555 | 0 |
| 0.975 | 0 |
| 0.9756944444444445 | 0 |
| 0.9763888888888889 | 0 |
| 0.9770833333333333 | 0 |
| 0.9777777777777777 | 0 |
| 0.9784722222222223 | 0 |
| 0.9791666666666666 | 0 |
| 0.9798611111111111 | 0 |
| 0.9805555555555556 | 0 |
| 0.9812500000000001 | 0 |
| 0.9819444444444444 | 0 |
| 0.9826388888888888 | 0 |
| 0.9833333333333334 | 0 |
| 0.9840277777777778 | 0 |
| 0.9847222222222222 | 0 |
| 0.9854166666666666 | 0 |
| 0.9861111111111112 | 0 |
| 0.9868055555555556 | 0 |
| 0.9874999999999999 | 0 |
| 0.9881944444444444 | 0 |
| 0.9888888888888889 | 0 |
| 0.9895833333333334 | 0 |
| 0.9902777777777777 | 0 |
| 0.9909722222222223 | 0 |
| 0.9916666666666667 | 0 |
| 0.9923611111111111 | 0 |
| 0.9930555555555555 | 0 |
| 0.99375 | 0 |
| 0.9944444444444445 | 0 |
| 0.9951388888888889 | 0 |
| 0.9958333333333332 | 0 |
| 0.9965277777777778 | 0 |
| 0.9972222222222222 | 0 |
| 0.9979166666666667 | 0 |
| 0.998611111111111 | 0 |
| 0.9993055555555556 | 0 |